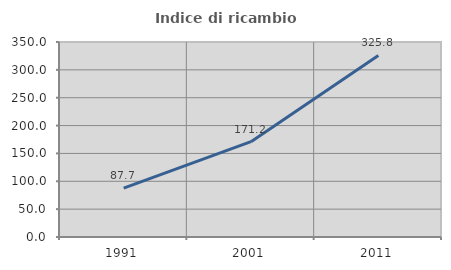
| Category | Indice di ricambio occupazionale  |
|---|---|
| 1991.0 | 87.662 |
| 2001.0 | 171.171 |
| 2011.0 | 325.806 |